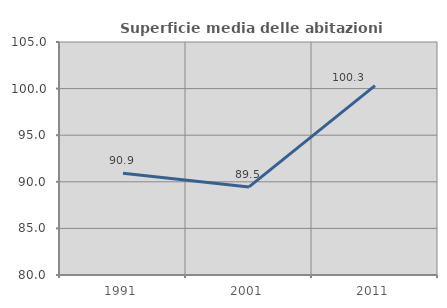
| Category | Superficie media delle abitazioni occupate |
|---|---|
| 1991.0 | 90.922 |
| 2001.0 | 89.451 |
| 2011.0 | 100.327 |